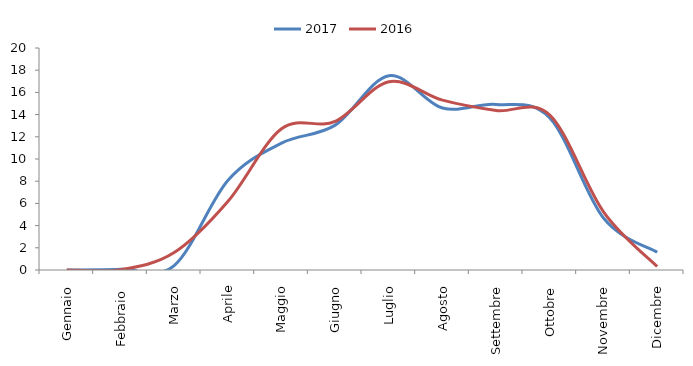
| Category | 2017 | 2016 |
|---|---|---|
| Gennaio | 0 | 0 |
| Febbraio  | 0.06 | 0.03 |
| Marzo | 0.4 | 1.57 |
| Aprile | 8.07 | 6.17 |
| Maggio | 11.43 | 12.72 |
| Giugno | 13.05 | 13.38 |
| Luglio | 17.5 | 16.96 |
| Agosto | 14.59 | 15.3 |
| Settembre | 14.92 | 14.37 |
| Ottobre | 13.7 | 13.95 |
| Novembre | 4.68 | 5.24 |
| Dicembre | 1.6 | 0.31 |